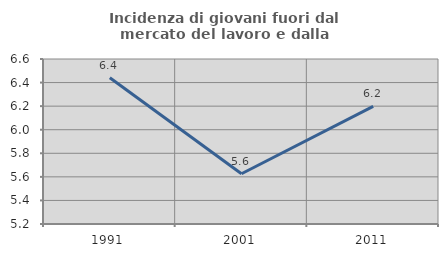
| Category | Incidenza di giovani fuori dal mercato del lavoro e dalla formazione  |
|---|---|
| 1991.0 | 6.441 |
| 2001.0 | 5.626 |
| 2011.0 | 6.199 |